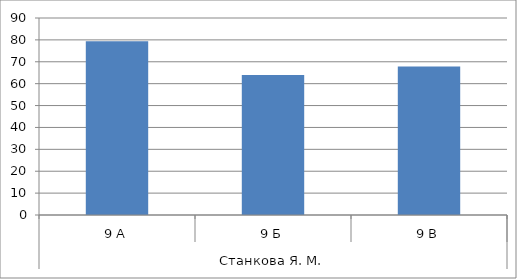
| Category | Series 0 |
|---|---|
| 0 | 79.412 |
| 1 | 64 |
| 2 | 67.857 |